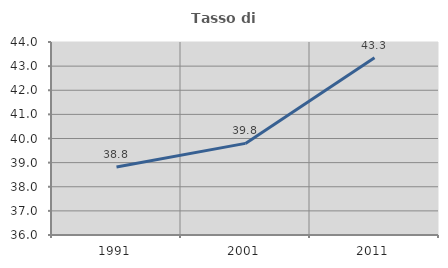
| Category | Tasso di occupazione   |
|---|---|
| 1991.0 | 38.822 |
| 2001.0 | 39.798 |
| 2011.0 | 43.344 |